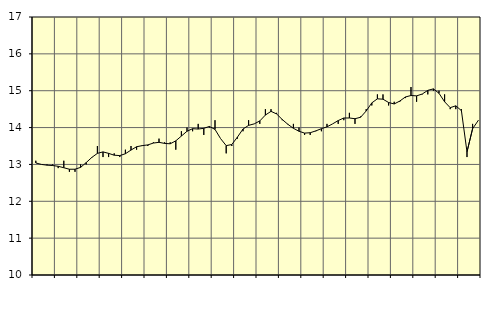
| Category | Piggar | Handel, SNI 45-47 |
|---|---|---|
| nan | 13.1 | 13.04 |
| 1.0 | 13 | 13 |
| 1.0 | 13 | 12.98 |
| 1.0 | 13 | 12.97 |
| nan | 12.9 | 12.95 |
| 2.0 | 13.1 | 12.91 |
| 2.0 | 12.8 | 12.87 |
| 2.0 | 12.8 | 12.87 |
| nan | 13 | 12.92 |
| 3.0 | 13 | 13.05 |
| 3.0 | 13.2 | 13.19 |
| 3.0 | 13.5 | 13.3 |
| nan | 13.2 | 13.34 |
| 4.0 | 13.2 | 13.3 |
| 4.0 | 13.3 | 13.25 |
| 4.0 | 13.2 | 13.24 |
| nan | 13.4 | 13.29 |
| 5.0 | 13.5 | 13.39 |
| 5.0 | 13.4 | 13.48 |
| 5.0 | 13.5 | 13.51 |
| nan | 13.5 | 13.53 |
| 6.0 | 13.6 | 13.58 |
| 6.0 | 13.7 | 13.6 |
| 6.0 | 13.6 | 13.57 |
| nan | 13.6 | 13.56 |
| 7.0 | 13.4 | 13.64 |
| 7.0 | 13.9 | 13.77 |
| 7.0 | 14 | 13.9 |
| nan | 13.9 | 13.97 |
| 8.0 | 14.1 | 13.96 |
| 8.0 | 13.8 | 13.98 |
| 8.0 | 14 | 14.03 |
| nan | 14.2 | 13.95 |
| 9.0 | 13.7 | 13.7 |
| 9.0 | 13.3 | 13.51 |
| 9.0 | 13.5 | 13.54 |
| nan | 13.7 | 13.74 |
| 10.0 | 13.9 | 13.96 |
| 10.0 | 14.2 | 14.06 |
| 10.0 | 14.1 | 14.1 |
| nan | 14.1 | 14.18 |
| 11.0 | 14.5 | 14.34 |
| 11.0 | 14.5 | 14.44 |
| 11.0 | 14.4 | 14.37 |
| nan | 14.2 | 14.22 |
| 12.0 | 14.1 | 14.09 |
| 12.0 | 14.1 | 13.98 |
| 12.0 | 14 | 13.9 |
| nan | 13.8 | 13.85 |
| 13.0 | 13.8 | 13.86 |
| 13.0 | 13.9 | 13.91 |
| 13.0 | 13.9 | 13.97 |
| nan | 14.1 | 14.02 |
| 14.0 | 14.1 | 14.1 |
| 14.0 | 14.1 | 14.19 |
| 14.0 | 14.2 | 14.26 |
| nan | 14.4 | 14.26 |
| 15.0 | 14.1 | 14.24 |
| 15.0 | 14.3 | 14.28 |
| 15.0 | 14.5 | 14.45 |
| nan | 14.6 | 14.67 |
| 16.0 | 14.9 | 14.78 |
| 16.0 | 14.9 | 14.77 |
| 16.0 | 14.6 | 14.68 |
| nan | 14.7 | 14.64 |
| 17.0 | 14.7 | 14.72 |
| 17.0 | 14.8 | 14.83 |
| 17.0 | 15.1 | 14.87 |
| nan | 14.7 | 14.86 |
| 18.0 | 14.9 | 14.91 |
| 18.0 | 14.9 | 15.01 |
| 18.0 | 15 | 15.05 |
| nan | 15 | 14.93 |
| 19.0 | 14.9 | 14.7 |
| 19.0 | 14.5 | 14.54 |
| 19.0 | 14.5 | 14.59 |
| nan | 14.5 | 14.46 |
| 20.0 | 13.2 | 13.34 |
| 20.0 | 14.1 | 13.97 |
| 20.0 | 14.2 | 14.19 |